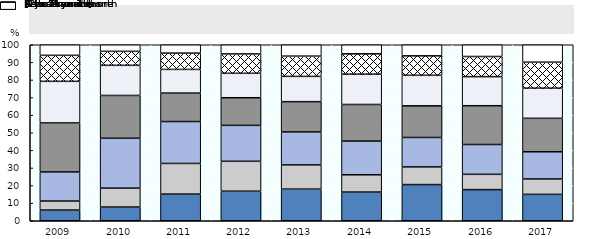
| Category | 4 years and more | [2 to 4 years[ | [1 to 2 years[ | 6 to 11 months | 3 to 5 months | 1 to 2 months | Less than 1 month |
|---|---|---|---|---|---|---|---|
| 2009.0 | 6.065 | 5.132 | 16.537 | 27.838 | 23.639 | 14.774 | 6.013 |
| 2010.0 | 7.786 | 10.754 | 28.321 | 24.331 | 17.129 | 7.932 | 3.747 |
| 2011.0 | 15.144 | 17.428 | 23.798 | 16.166 | 13.462 | 9.255 | 4.748 |
| 2012.0 | 16.796 | 16.99 | 20.413 | 15.698 | 13.889 | 10.982 | 5.233 |
| 2013.0 | 17.968 | 13.77 | 18.724 | 17.212 | 14.358 | 11.503 | 6.465 |
| 2014.0 | 16.301 | 9.819 | 19.161 | 20.782 | 17.255 | 11.535 | 5.148 |
| 2015.0 | 20.558 | 10.021 | 16.736 | 17.975 | 17.355 | 11.054 | 6.302 |
| 2016.0 | 17.691 | 8.686 | 16.949 | 22.034 | 16.525 | 11.441 | 6.674 |
| 2017.0 | 14.994 | 8.737 | 15.466 | 19.008 | 17.119 | 14.758 | 9.917 |